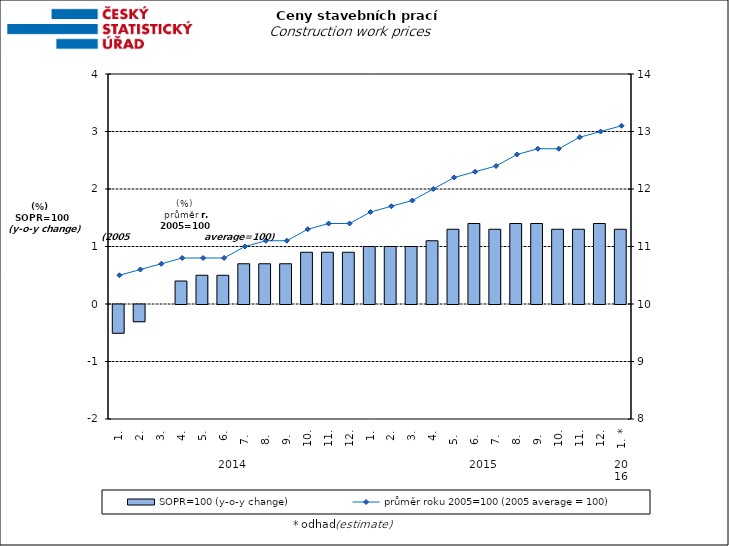
| Category | SOPR=100 (y-o-y change)   |
|---|---|
| 0 | -0.5 |
| 1 | -0.3 |
| 2 | 0 |
| 3 | 0.4 |
| 4 | 0.5 |
| 5 | 0.5 |
| 6 | 0.7 |
| 7 | 0.7 |
| 8 | 0.7 |
| 9 | 0.9 |
| 10 | 0.9 |
| 11 | 0.9 |
| 12 | 1 |
| 13 | 1 |
| 14 | 1 |
| 15 | 1.1 |
| 16 | 1.3 |
| 17 | 1.4 |
| 18 | 1.3 |
| 19 | 1.4 |
| 20 | 1.4 |
| 21 | 1.3 |
| 22 | 1.3 |
| 23 | 1.4 |
| 24 | 1.3 |